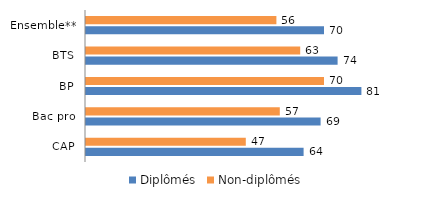
| Category | Diplômés | Non-diplômés |
|---|---|---|
| CAP | 64 | 47 |
| Bac pro | 69 | 57 |
| BP | 81 | 70 |
| BTS | 74 | 63 |
| Ensemble** | 70 | 56 |